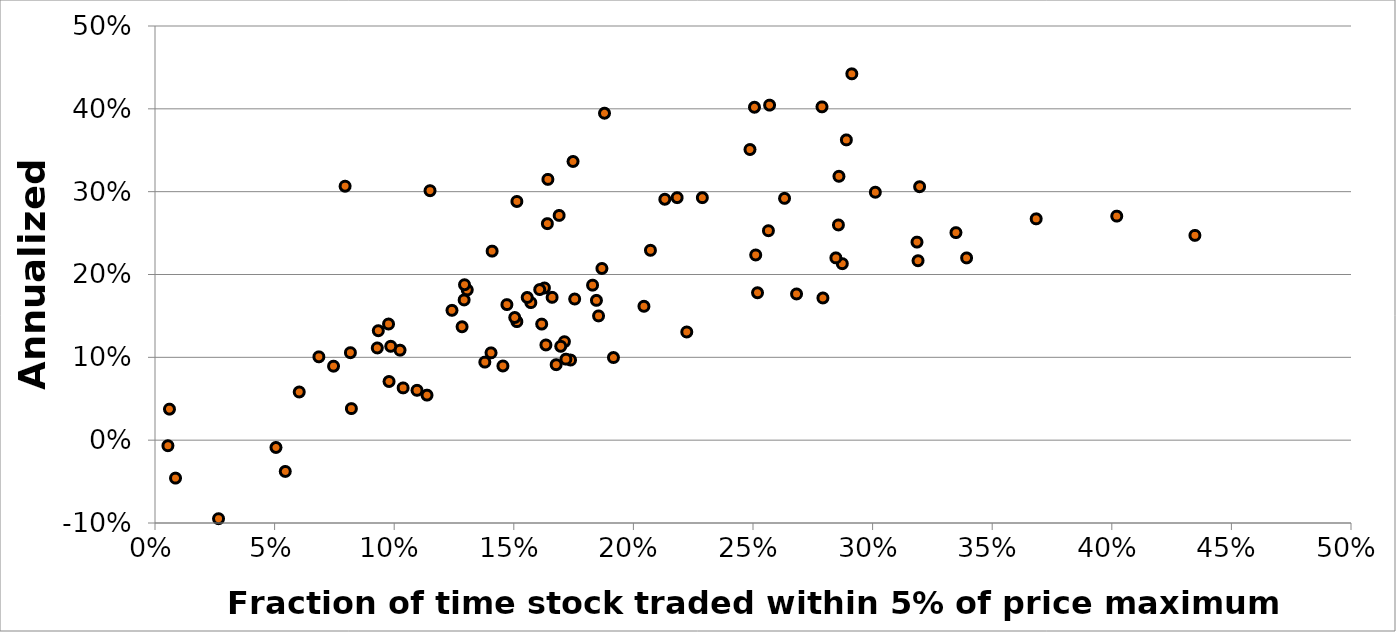
| Category | Annualized Return |
|---|---|
| 0.4347450302506482 | 0.247 |
| 0.40207522697795073 | 0.27 |
| 0.3683862433862434 | 0.267 |
| 0.3393011839445567 | 0.22 |
| 0.33484651967142237 | 0.251 |
| 0.3196480938416422 | 0.306 |
| 0.31899719040414953 | 0.217 |
| 0.3185595567867036 | 0.239 |
| 0.3011416229558778 | 0.299 |
| 0.2913133165253266 | 0.442 |
| 0.28903498473820144 | 0.363 |
| 0.28733376934815785 | 0.213 |
| 0.2859323882224646 | 0.319 |
| 0.2857142857142857 | 0.26 |
| 0.2846420323325635 | 0.22 |
| 0.2792306029824941 | 0.172 |
| 0.27883981542518127 | 0.402 |
| 0.26820834233844826 | 0.177 |
| 0.26319204152249137 | 0.292 |
| 0.2569384215091067 | 0.404 |
| 0.2564491654021244 | 0.253 |
| 0.2518918918918919 | 0.178 |
| 0.2511356262167424 | 0.224 |
| 0.25061425061425063 | 0.402 |
| 0.24874096781256844 | 0.351 |
| 0.2288202692003167 | 0.293 |
| 0.22231852654387865 | 0.131 |
| 0.21828398530365248 | 0.293 |
| 0.2131324004305705 | 0.291 |
| 0.20712401055408972 | 0.229 |
| 0.20440795159896283 | 0.162 |
| 0.19165946413137425 | 0.1 |
| 0.1879224876070302 | 0.395 |
| 0.18683697770080104 | 0.207 |
| 0.1854333261292414 | 0.15 |
| 0.1845474613686534 | 0.169 |
| 0.18292987272273523 | 0.187 |
| 0.17545375972342264 | 0.17 |
| 0.17476800707026072 | 0.336 |
| 0.17372515125324114 | 0.097 |
| 0.17178046672428696 | 0.098 |
| 0.17116922411929977 | 0.119 |
| 0.16961970613656008 | 0.113 |
| 0.16895488932474081 | 0.271 |
| 0.16771125999567754 | 0.091 |
| 0.16601477618426771 | 0.172 |
| 0.16425329587205534 | 0.315 |
| 0.16403717311432894 | 0.261 |
| 0.16342412451361868 | 0.115 |
| 0.1628108108108108 | 0.184 |
| 0.16165982277933866 | 0.14 |
| 0.1608300907911803 | 0.182 |
| 0.1571212448670845 | 0.166 |
| 0.15560838556299977 | 0.172 |
| 0.15128593040847202 | 0.288 |
| 0.15128593040847202 | 0.143 |
| 0.15038893690579083 | 0.148 |
| 0.1471241668723772 | 0.164 |
| 0.14545061594985953 | 0.09 |
| 0.14094249891915261 | 0.228 |
| 0.1404797925221526 | 0.105 |
| 0.1378863194294359 | 0.094 |
| 0.13053814566673871 | 0.181 |
| 0.12939453125 | 0.188 |
| 0.12924140912038037 | 0.169 |
| 0.12837691808947482 | 0.137 |
| 0.12416179969716634 | 0.157 |
| 0.11497730711043873 | 0.301 |
| 0.11371629542790153 | 0.054 |
| 0.10953800298062594 | 0.06 |
| 0.10372960372960373 | 0.063 |
| 0.10244218716230818 | 0.109 |
| 0.09855197752323319 | 0.113 |
| 0.09784661881375141 | 0.071 |
| 0.09763513513513514 | 0.14 |
| 0.09335687486206136 | 0.132 |
| 0.0929327858223471 | 0.111 |
| 0.0821000704721635 | 0.038 |
| 0.08169440242057488 | 0.106 |
| 0.07947019867549669 | 0.307 |
| 0.074643011683254 | 0.089 |
| 0.06851091419926518 | 0.101 |
| 0.06029824940566242 | 0.058 |
| 0.054455445544554455 | -0.038 |
| 0.05056947608200456 | -0.009 |
| 0.026564774381368266 | -0.095 |
| 0.008581752484191508 | -0.046 |
| 0.006050129645635264 | 0.037 |
| 0.0054019014693171994 | -0.007 |